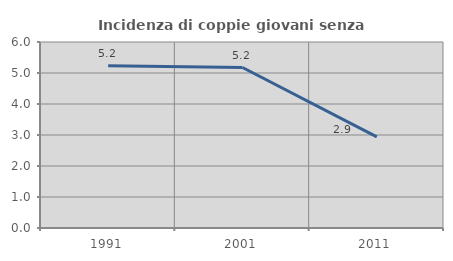
| Category | Incidenza di coppie giovani senza figli |
|---|---|
| 1991.0 | 5.235 |
| 2001.0 | 5.176 |
| 2011.0 | 2.939 |